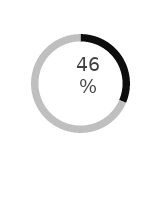
| Category | Series 0 |
|---|---|
| Frauen | 0.458 |
| Prozent | 1 |